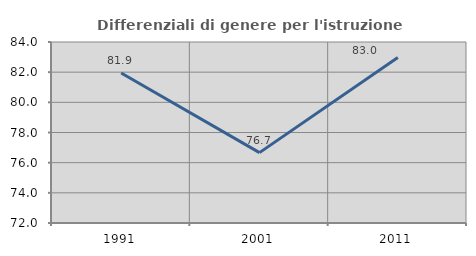
| Category | Differenziali di genere per l'istruzione superiore |
|---|---|
| 1991.0 | 81.941 |
| 2001.0 | 76.665 |
| 2011.0 | 82.976 |